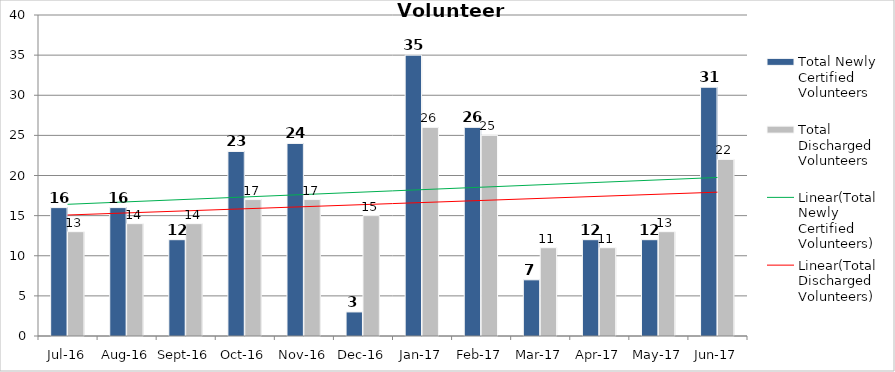
| Category | Total Newly Certified Volunteers | Total Discharged Volunteers |
|---|---|---|
| Jul-16 | 16 | 13 |
| Aug-16 | 16 | 14 |
| Sep-16 | 12 | 14 |
| Oct-16 | 23 | 17 |
| Nov-16 | 24 | 17 |
| Dec-16 | 3 | 15 |
| Jan-17 | 35 | 26 |
| Feb-17 | 26 | 25 |
| Mar-17 | 7 | 11 |
| Apr-17 | 12 | 11 |
| May-17 | 12 | 13 |
| Jun-17 | 31 | 22 |